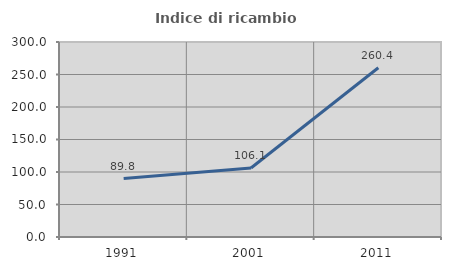
| Category | Indice di ricambio occupazionale  |
|---|---|
| 1991.0 | 89.827 |
| 2001.0 | 106.09 |
| 2011.0 | 260.396 |